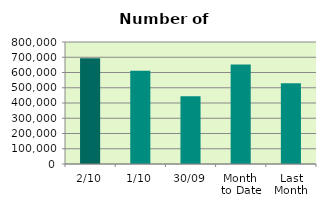
| Category | Series 0 |
|---|---|
| 2/10 | 692762 |
| 1/10 | 611554 |
| 30/09 | 444656 |
| Month 
to Date | 652158 |
| Last
Month | 529677.905 |